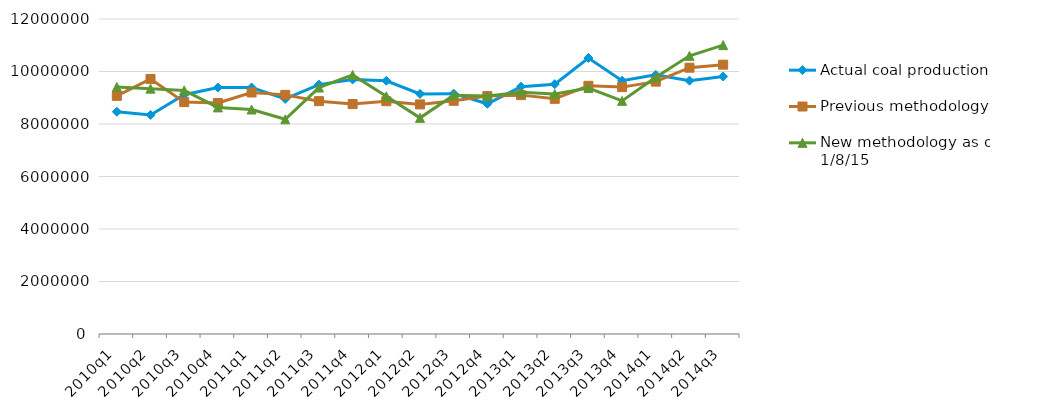
| Category | Actual coal production | Previous methodology | New methodology as of 1/8/15 |
|---|---|---|---|
| 2010q1 | 8466083 | 9071638 | 9413611 |
| 2010q2 | 8344930 | 9717132 | 9347134 |
| 2010q3 | 9115455 | 8833736 | 9280039 |
| 2010q4 | 9390163 | 8800155 | 8632273 |
| 2011q1 | 9391494 | 9200592 | 8552431 |
| 2011q2 | 8955537 | 9109543 | 8178560 |
| 2011q3 | 9500324 | 8869942 | 9388211 |
| 2011q4 | 9696892 | 8759191 | 9870795 |
| 2012q1 | 9646859 | 8867413 | 9055584 |
| 2012q2 | 9147275 | 8746521 | 8233890 |
| 2012q3 | 9155483 | 8883945 | 9098644 |
| 2012q4 | 8770557 | 9062821 | 9064115 |
| 2013q1 | 9421880 | 9099723 | 9207833 |
| 2013q2 | 9516460 | 8958988 | 9139982 |
| 2013q3 | 10515152 | 9454614 | 9369230 |
| 2013q4 | 9648342 | 9405047 | 8881601 |
| 2014q1 | 9872294 | 9614936 | 9780780 |
| 2014q2 | 9650263 | 10144762 | 10597182 |
| 2014q3 | 9808167 | 10260551 | 11004149 |